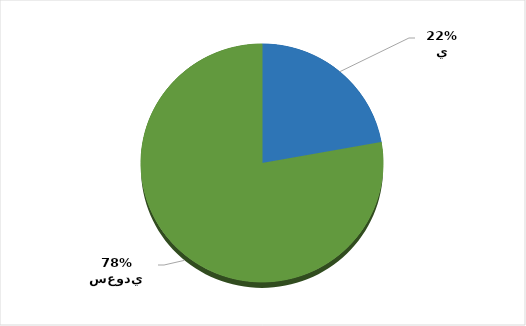
| Category | Series 0 |
|---|---|
| سعودي | 114808 |
| غير سعودي | 402471 |